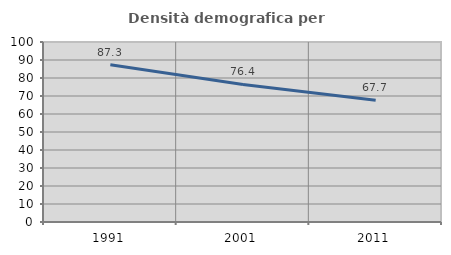
| Category | Densità demografica |
|---|---|
| 1991.0 | 87.331 |
| 2001.0 | 76.405 |
| 2011.0 | 67.68 |